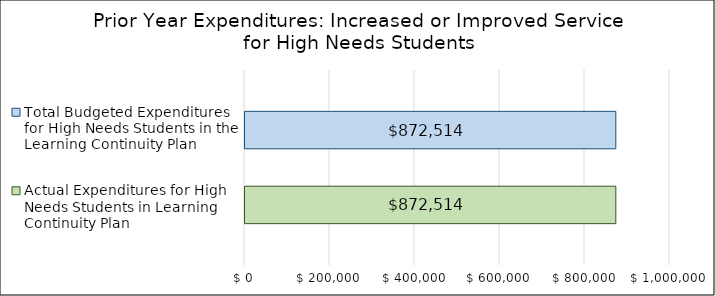
| Category | Actual Expenditures for High Needs Students in Learning Continuity Plan | Total Budgeted Expenditures for High Needs Students in the Learning Continuity Plan |
|---|---|---|
| 0 | 872514 | 872514 |